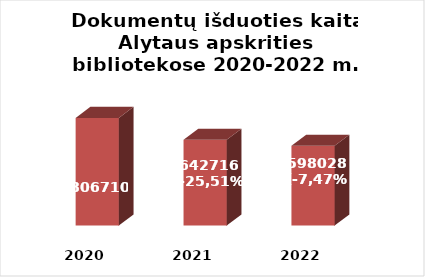
| Category | Series 0 |
|---|---|
| 2020.0 | 806710 |
| 2021.0 | 642716 |
| 2022.0 | 598028 |